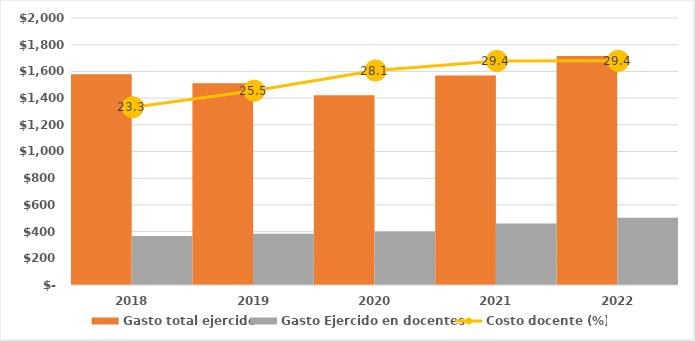
| Category | Gasto total ejercido | Gasto Ejercido en docentes |
|---|---|---|
| 2018.0 | 1578480 | 367837.29 |
| 2019.0 | 1511221.007 | 384815.8 |
| 2020.0 | 1422248.821 | 399892.8 |
| 2021.0 | 1569932.387 | 461057.181 |
| 2022.0 | 1716208.933 | 504351.183 |